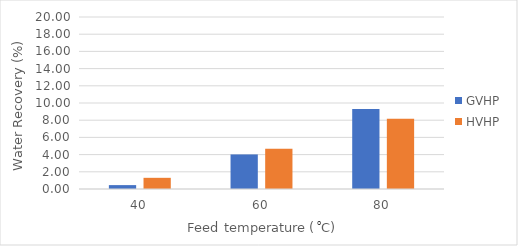
| Category | GVHP | HVHP |
|---|---|---|
| 40.0 | 0.452 | 1.3 |
| 60.0 | 4.02 | 4.69 |
| 80.0 | 9.302 | 8.17 |